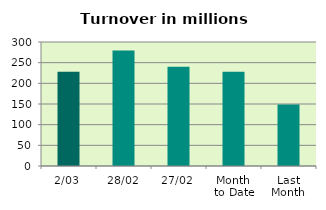
| Category | Series 0 |
|---|---|
| 2/03 | 228.318 |
| 28/02 | 279.426 |
| 27/02 | 239.883 |
| Month 
to Date | 228.318 |
| Last
Month | 148.578 |